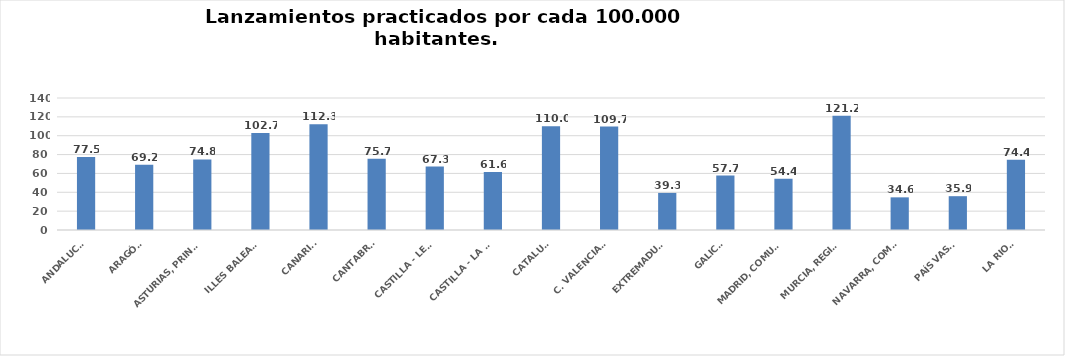
| Category | Series 0 |
|---|---|
| ANDALUCÍA | 77.476 |
| ARAGÓN | 69.214 |
| ASTURIAS, PRINCIPADO | 74.849 |
| ILLES BALEARS | 102.749 |
| CANARIAS | 112.274 |
| CANTABRIA | 75.674 |
| CASTILLA - LEÓN | 67.267 |
| CASTILLA - LA MANCHA | 61.559 |
| CATALUÑA | 110.027 |
| C. VALENCIANA | 109.73 |
| EXTREMADURA | 39.345 |
| GALICIA | 57.722 |
| MADRID, COMUNIDAD | 54.412 |
| MURCIA, REGIÓN | 121.224 |
| NAVARRA, COM. FORAL | 34.632 |
| PAÍS VASCO | 35.867 |
| LA RIOJA | 74.4 |